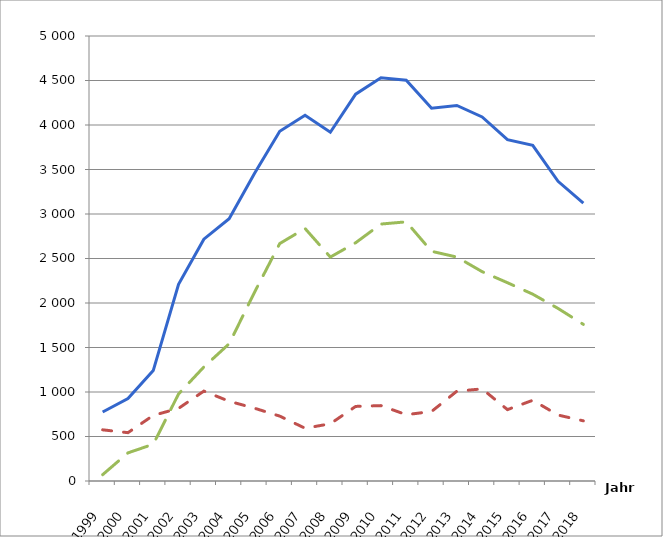
| Category | Series 0 | Series 1 | Series 2 |
|---|---|---|---|
| 1999.0 | 775 | 575 | 71 |
| 2000.0 | 926 | 543 | 316 |
| 2001.0 | 1241 | 737 | 413 |
| 2002.0 | 2211 | 816 | 978 |
| 2003.0 | 2717 | 1010 | 1281 |
| 2004.0 | 2947 | 896 | 1542 |
| 2005.0 | 3455 | 818 | 2119 |
| 2006.0 | 3929 | 729 | 2668 |
| 2007.0 | 4110 | 593 | 2837 |
| 2008.0 | 3919 | 643 | 2516 |
| 2009.0 | 4346 | 838 | 2677 |
| 2010.0 | 4530 | 847 | 2887 |
| 2011.0 | 4503 | 745 | 2912 |
| 2012.0 | 4188 | 781 | 2581 |
| 2013.0 | 4220 | 1009 | 2516 |
| 2014.0 | 4091 | 1035 | 2352 |
| 2015.0 | 3835 | 802 | 2228 |
| 2016.0 | 3772 | 907 | 2099 |
| 2017.0 | 3367 | 741 | 1939 |
| 2018.0 | 3122 | 676 | 1760 |